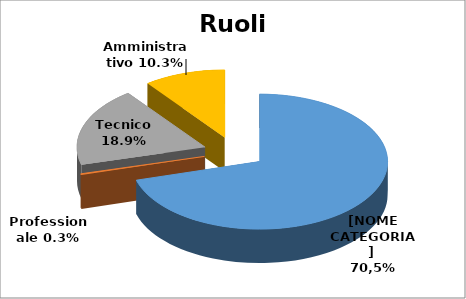
| Category | Series 0 |
|---|---|
| Sanitario | 0.706 |
| Professionale | 0.003 |
| Tecnico | 0.189 |
| Amministrativo | 0.103 |